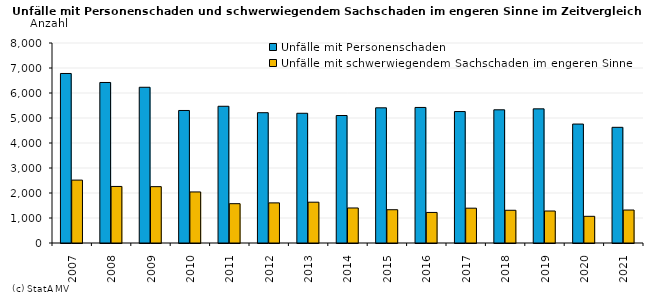
| Category | Unfälle mit Personenschaden | Unfälle mit schwerwiegendem Sachschaden im engeren Sinne |
|---|---|---|
| 2007.0 | 6781 | 2516 |
| 2008.0 | 6421 | 2262 |
| 2009.0 | 6229 | 2254 |
| 2010.0 | 5301 | 2042 |
| 2011.0 | 5469 | 1573 |
| 2012.0 | 5212 | 1605 |
| 2013.0 | 5189 | 1632 |
| 2014.0 | 5100 | 1401 |
| 2015.0 | 5407 | 1331 |
| 2016.0 | 5422 | 1222 |
| 2017.0 | 5258 | 1393 |
| 2018.0 | 5328 | 1309 |
| 2019.0 | 5366 | 1280 |
| 2020.0 | 4758 | 1067 |
| 2021.0 | 4627 | 1319 |